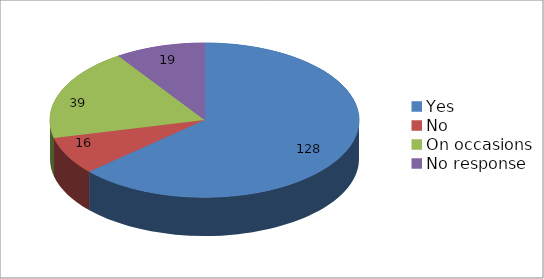
| Category | Series 0 |
|---|---|
| Yes  | 128 |
| No  | 16 |
| On occasions | 39 |
| No response | 19 |